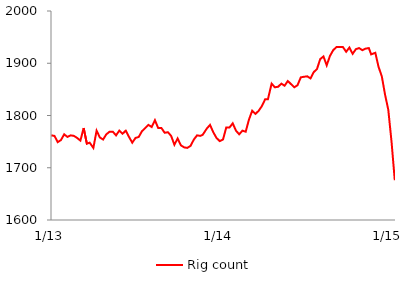
| Category | Rig count |
|---|---|
| 2013-01-04 | 1762 |
| 2013-01-11 | 1761 |
| 2013-01-18 | 1749 |
| 2013-01-25 | 1753 |
| 2013-02-01 | 1764 |
| 2013-02-08 | 1759 |
| 2013-02-15 | 1762 |
| 2013-02-22 | 1761 |
| 2013-03-01 | 1757 |
| 2013-03-08 | 1752 |
| 2013-03-15 | 1776 |
| 2013-03-22 | 1746 |
| 2013-03-28 | 1748 |
| 2013-04-05 | 1738 |
| 2013-04-12 | 1771 |
| 2013-04-19 | 1758 |
| 2013-04-26 | 1754 |
| 2013-05-03 | 1764 |
| 2013-05-10 | 1769 |
| 2013-05-17 | 1769 |
| 2013-05-24 | 1762 |
| 2013-05-31 | 1771 |
| 2013-06-07 | 1765 |
| 2013-06-14 | 1771 |
| 2013-06-21 | 1759 |
| 2013-06-28 | 1748 |
| 2013-07-05 | 1757 |
| 2013-07-12 | 1759 |
| 2013-07-19 | 1770 |
| 2013-07-26 | 1776 |
| 2013-08-02 | 1782 |
| 2013-08-09 | 1778 |
| 2013-08-16 | 1791 |
| 2013-08-23 | 1776 |
| 2013-08-30 | 1776 |
| 2013-09-06 | 1767 |
| 2013-09-13 | 1768 |
| 2013-09-20 | 1761 |
| 2013-09-27 | 1744 |
| 2013-10-04 | 1756 |
| 2013-10-11 | 1743 |
| 2013-10-18 | 1739 |
| 2013-10-25 | 1738 |
| 2013-11-01 | 1742 |
| 2013-11-08 | 1754 |
| 2013-11-15 | 1762 |
| 2013-11-22 | 1761 |
| 2013-11-27 | 1763 |
| 2013-12-06 | 1775 |
| 2013-12-13 | 1782 |
| 2013-12-20 | 1768 |
| 2013-12-27 | 1757 |
| 2014-01-03 | 1751 |
| 2014-01-10 | 1754 |
| 2014-01-17 | 1777 |
| 2014-01-24 | 1777 |
| 2014-01-31 | 1785 |
| 2014-02-07 | 1771 |
| 2014-02-14 | 1764 |
| 2014-02-21 | 1771 |
| 2014-02-28 | 1769 |
| 2014-03-07 | 1792 |
| 2014-03-14 | 1809 |
| 2014-03-21 | 1803 |
| 2014-03-28 | 1809 |
| 2014-04-04 | 1818 |
| 2014-04-11 | 1831 |
| 2014-04-17 | 1831 |
| 2014-04-25 | 1861 |
| 2014-05-02 | 1854 |
| 2014-05-09 | 1855 |
| 2014-05-16 | 1861 |
| 2014-05-23 | 1857 |
| 2014-05-30 | 1866 |
| 2014-06-06 | 1860 |
| 2014-06-13 | 1854 |
| 2014-06-20 | 1858 |
| 2014-06-27 | 1873 |
| 2014-07-03 | 1874 |
| 2014-07-11 | 1875 |
| 2014-07-18 | 1871 |
| 2014-07-25 | 1883 |
| 2014-08-01 | 1889 |
| 2014-08-08 | 1908 |
| 2014-08-15 | 1913 |
| 2014-08-22 | 1896 |
| 2014-08-29 | 1914 |
| 2014-09-05 | 1925 |
| 2014-09-12 | 1931 |
| 2014-09-19 | 1931 |
| 2014-09-26 | 1931 |
| 2014-10-03 | 1922 |
| 2014-10-10 | 1930 |
| 2014-10-17 | 1918 |
| 2014-10-24 | 1927 |
| 2014-10-31 | 1929 |
| 2014-11-07 | 1925 |
| 2014-11-14 | 1928 |
| 2014-11-21 | 1929 |
| 2014-11-26 | 1917 |
| 2014-12-05 | 1920 |
| 2014-12-12 | 1893 |
| 2014-12-19 | 1875 |
| 2014-12-26 | 1840 |
| 2015-01-02 | 1811 |
| 2015-01-09 | 1750 |
| 2015-01-16 | 1676 |